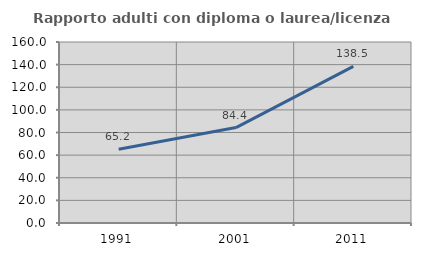
| Category | Rapporto adulti con diploma o laurea/licenza media  |
|---|---|
| 1991.0 | 65.185 |
| 2001.0 | 84.375 |
| 2011.0 | 138.509 |